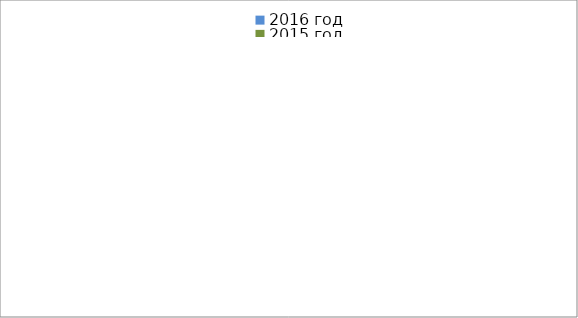
| Category | 2016 год | 2015 год |
|---|---|---|
|  - поджог | 44 | 35 |
|  - неосторожное обращение с огнём | 24 | 61 |
|  - НПТЭ электрооборудования | 24 | 15 |
|  - НПУ и Э печей | 41 | 63 |
|  - НПУ и Э транспортных средств | 50 | 44 |
|   -Шалость с огнем детей | 6 | 3 |
|  -НППБ при эксплуатации эл.приборов | 27 | 15 |
|  - курение | 36 | 28 |
| - прочие | 100 | 103 |
| - не установленные причины | 12 | 23 |